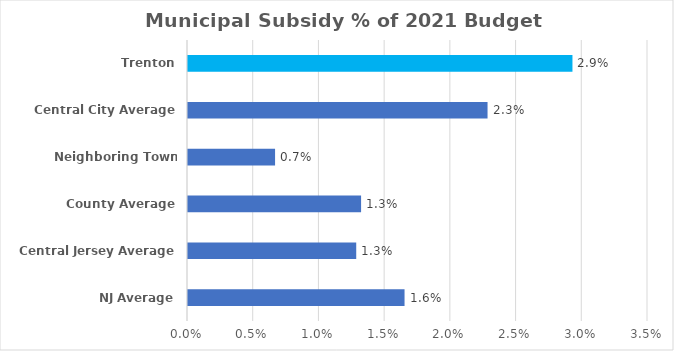
| Category | Municipal Subsidy % of 2021 Budget Appropriation |
|---|---|
| NJ Average | 0.016 |
| Central Jersey Average | 0.013 |
| County Average | 0.013 |
| Neighboring Town Average | 0.007 |
| Central City Average | 0.023 |
| Trenton | 0.029 |